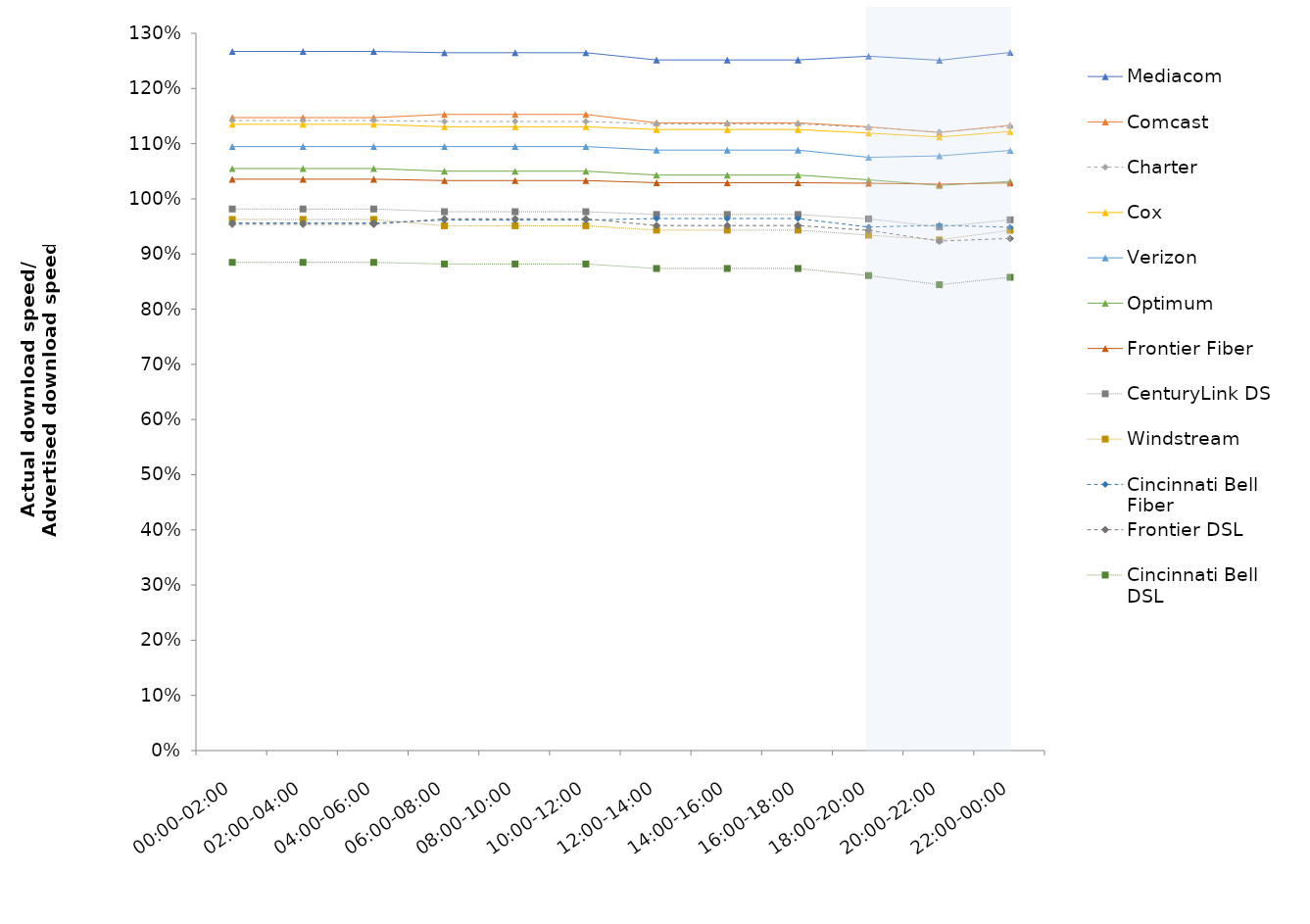
| Category | Mediacom | Comcast | Charter | Cox | Verizon | Optimum | Frontier Fiber | CenturyLink DSL | Windstream | Cincinnati Bell Fiber | Frontier DSL | Cincinnati Bell DSL |
|---|---|---|---|---|---|---|---|---|---|---|---|---|
| 00:00-02:00 | 1.267 | 1.147 | 1.142 | 1.135 | 1.095 | 1.055 | 1.036 | 0.982 | 0.963 | 0.956 | 0.954 | 0.885 |
| 02:00-04:00 | 1.267 | 1.147 | 1.142 | 1.135 | 1.095 | 1.055 | 1.036 | 0.982 | 0.963 | 0.956 | 0.954 | 0.885 |
| 04:00-06:00 | 1.267 | 1.147 | 1.142 | 1.135 | 1.095 | 1.055 | 1.036 | 0.982 | 0.963 | 0.956 | 0.954 | 0.885 |
| 06:00-08:00 | 1.265 | 1.153 | 1.14 | 1.131 | 1.095 | 1.05 | 1.033 | 0.977 | 0.951 | 0.961 | 0.964 | 0.882 |
| 08:00-10:00 | 1.265 | 1.153 | 1.14 | 1.131 | 1.095 | 1.05 | 1.033 | 0.977 | 0.951 | 0.961 | 0.964 | 0.882 |
| 10:00-12:00 | 1.265 | 1.153 | 1.14 | 1.131 | 1.095 | 1.05 | 1.033 | 0.977 | 0.951 | 0.961 | 0.964 | 0.882 |
| 12:00-14:00 | 1.252 | 1.138 | 1.136 | 1.126 | 1.088 | 1.043 | 1.029 | 0.972 | 0.943 | 0.964 | 0.952 | 0.874 |
| 14:00-16:00 | 1.252 | 1.138 | 1.136 | 1.126 | 1.088 | 1.043 | 1.029 | 0.972 | 0.943 | 0.964 | 0.952 | 0.874 |
| 16:00-18:00 | 1.252 | 1.138 | 1.136 | 1.126 | 1.088 | 1.043 | 1.029 | 0.972 | 0.943 | 0.964 | 0.952 | 0.874 |
| 18:00-20:00 | 1.259 | 1.131 | 1.129 | 1.119 | 1.075 | 1.034 | 1.028 | 0.964 | 0.934 | 0.949 | 0.943 | 0.861 |
| 20:00-22:00 | 1.251 | 1.12 | 1.121 | 1.112 | 1.078 | 1.024 | 1.027 | 0.949 | 0.926 | 0.952 | 0.923 | 0.844 |
| 22:00-00:00 | 1.265 | 1.133 | 1.131 | 1.122 | 1.088 | 1.032 | 1.029 | 0.962 | 0.943 | 0.948 | 0.928 | 0.858 |